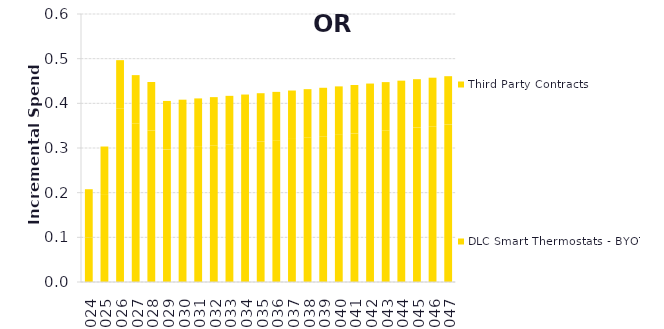
| Category | DLC Smart Thermostats - BYOT | Third Party Contracts |
|---|---|---|
| 2024.0 | 0.099 | 0.108 |
| 2025.0 | 0.195 | 0.108 |
| 2026.0 | 0.388 | 0.108 |
| 2027.0 | 0.355 | 0.108 |
| 2028.0 | 0.339 | 0.108 |
| 2029.0 | 0.297 | 0.108 |
| 2030.0 | 0.3 | 0.108 |
| 2031.0 | 0.303 | 0.108 |
| 2032.0 | 0.305 | 0.108 |
| 2033.0 | 0.308 | 0.108 |
| 2034.0 | 0.311 | 0.108 |
| 2035.0 | 0.314 | 0.108 |
| 2036.0 | 0.317 | 0.108 |
| 2037.0 | 0.32 | 0.108 |
| 2038.0 | 0.323 | 0.108 |
| 2039.0 | 0.326 | 0.108 |
| 2040.0 | 0.329 | 0.108 |
| 2041.0 | 0.333 | 0.108 |
| 2042.0 | 0.336 | 0.108 |
| 2043.0 | 0.339 | 0.108 |
| 2044.0 | 0.342 | 0.108 |
| 2045.0 | 0.346 | 0.108 |
| 2046.0 | 0.349 | 0.108 |
| 2047.0 | 0.352 | 0.108 |